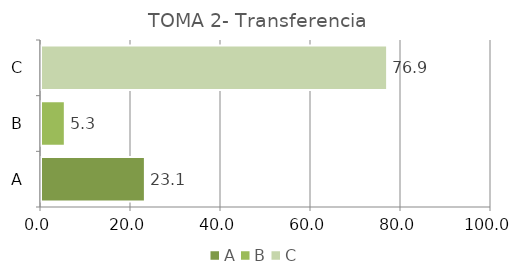
| Category | Series 0 |
|---|---|
| A | 23.088 |
| B | 5.294 |
| C | 76.912 |